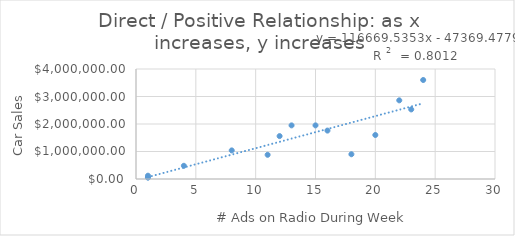
| Category | Car Sales |
|---|---|
| 12.0 | 1560000 |
| 1.0 | 60000 |
| 15.0 | 1950000 |
| 18.0 | 900000 |
| 16.0 | 1760000 |
| 1.0 | 50000 |
| 13.0 | 1950000 |
| 22.0 | 2860000 |
| 20.0 | 1600000 |
| 1.0 | 120000 |
| 4.0 | 480000 |
| 11.0 | 880000 |
| 24.0 | 3600000 |
| 8.0 | 1040000 |
| 23.0 | 2530000 |